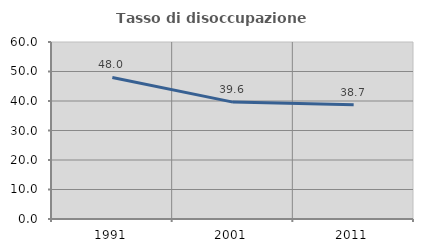
| Category | Tasso di disoccupazione giovanile  |
|---|---|
| 1991.0 | 47.967 |
| 2001.0 | 39.623 |
| 2011.0 | 38.71 |